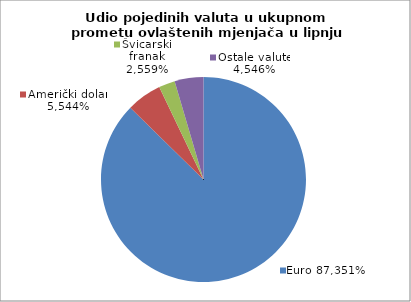
| Category | EUR |
|---|---|
| 0 | 0.874 |
| 1 | 0.055 |
| 2 | 0.026 |
| 3 | 0.045 |